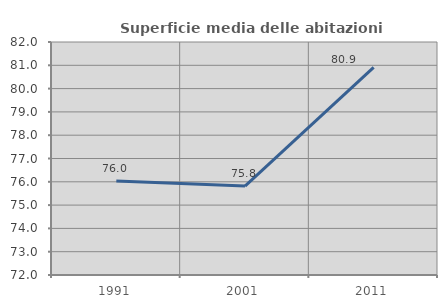
| Category | Superficie media delle abitazioni occupate |
|---|---|
| 1991.0 | 76.03 |
| 2001.0 | 75.816 |
| 2011.0 | 80.911 |